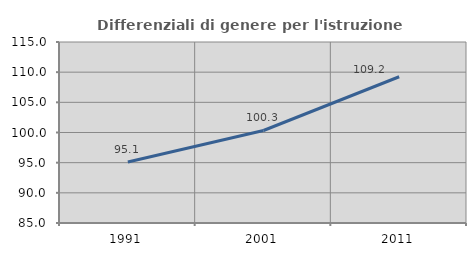
| Category | Differenziali di genere per l'istruzione superiore |
|---|---|
| 1991.0 | 95.11 |
| 2001.0 | 100.332 |
| 2011.0 | 109.239 |